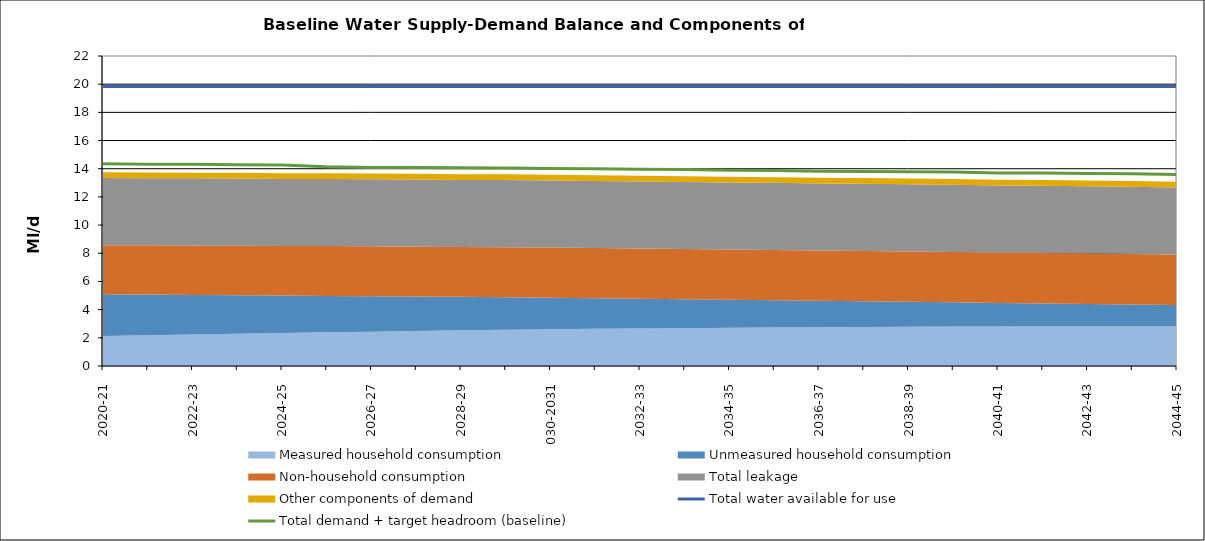
| Category | Total water available for use | Total demand + target headroom (baseline) |
|---|---|---|
| 0 | 19.84 | 14.345 |
| 1 | 19.84 | 14.321 |
| 2 | 19.84 | 14.31 |
| 3 | 19.84 | 14.281 |
| 4 | 19.84 | 14.258 |
| 5 | 19.84 | 14.132 |
| 6 | 19.84 | 14.095 |
| 7 | 19.84 | 14.091 |
| 8 | 19.84 | 14.067 |
| 9 | 19.84 | 14.047 |
| 10 | 19.84 | 14.024 |
| 11 | 19.84 | 13.994 |
| 12 | 19.84 | 13.955 |
| 13 | 19.84 | 13.94 |
| 14 | 19.84 | 13.895 |
| 15 | 19.84 | 13.873 |
| 16 | 19.84 | 13.824 |
| 17 | 19.84 | 13.811 |
| 18 | 19.84 | 13.781 |
| 19 | 19.84 | 13.763 |
| 20 | 19.84 | 13.7 |
| 21 | 19.84 | 13.689 |
| 22 | 19.84 | 13.664 |
| 23 | 19.84 | 13.652 |
| 24 | 19.84 | 13.595 |